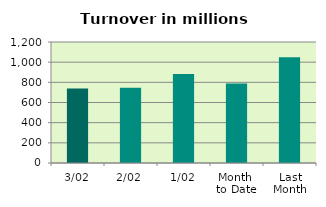
| Category | Series 0 |
|---|---|
| 3/02 | 738.732 |
| 2/02 | 747.284 |
| 1/02 | 882.231 |
| Month 
to Date | 789.416 |
| Last
Month | 1049.647 |